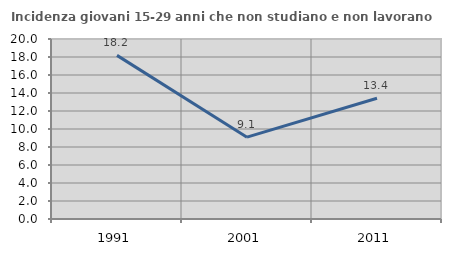
| Category | Incidenza giovani 15-29 anni che non studiano e non lavorano  |
|---|---|
| 1991.0 | 18.182 |
| 2001.0 | 9.091 |
| 2011.0 | 13.415 |